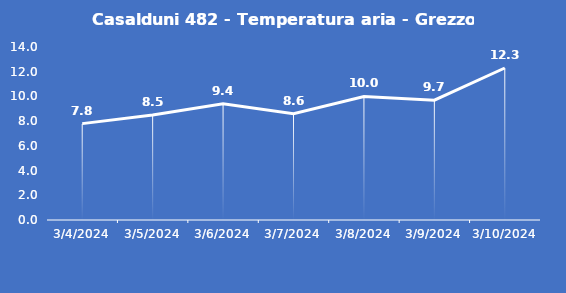
| Category | Casalduni 482 - Temperatura aria - Grezzo (°C) |
|---|---|
| 3/4/24 | 7.8 |
| 3/5/24 | 8.5 |
| 3/6/24 | 9.4 |
| 3/7/24 | 8.6 |
| 3/8/24 | 10 |
| 3/9/24 | 9.7 |
| 3/10/24 | 12.3 |